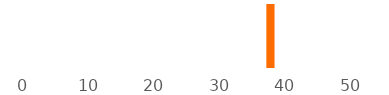
| Category | Top Conditions Opioids are Most Prescribed For | Condition |      Low Back Pain |
|---|---|---|---|
| 0 |  | 0 | 200 |